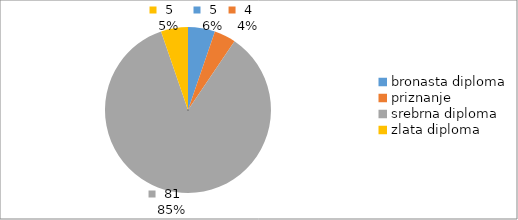
| Category | Series 0 |
|---|---|
| bronasta diploma | 5 |
| priznanje | 4 |
| srebrna diploma | 81 |
| zlata diploma | 5 |